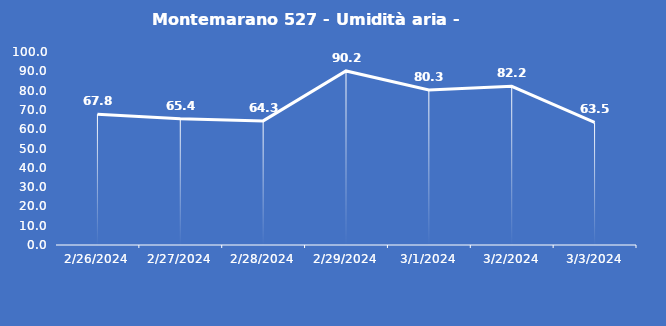
| Category | Montemarano 527 - Umidità aria - Grezzo (%) |
|---|---|
| 2/26/24 | 67.8 |
| 2/27/24 | 65.4 |
| 2/28/24 | 64.3 |
| 2/29/24 | 90.2 |
| 3/1/24 | 80.3 |
| 3/2/24 | 82.2 |
| 3/3/24 | 63.5 |